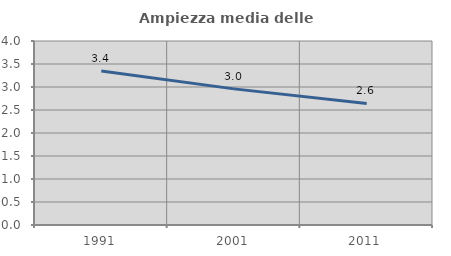
| Category | Ampiezza media delle famiglie |
|---|---|
| 1991.0 | 3.35 |
| 2001.0 | 2.959 |
| 2011.0 | 2.643 |